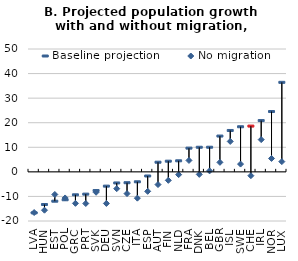
| Category | Baseline projection | No migration |
|---|---|---|
| LVA | -16.692 | -16.557 |
| HUN | -13.288 | -15.61 |
| EST | -11.939 | -9.202 |
| POL | -11.353 | -10.626 |
| GRC | -9.342 | -12.818 |
| PRT | -9.068 | -12.879 |
| SVK | -7.607 | -8.302 |
| DEU | -5.812 | -12.857 |
| SVN | -4.513 | -6.849 |
| CZE | -4.419 | -8.845 |
| ITA | -4.043 | -10.702 |
| ESP | -1.68 | -7.935 |
| AUT | 3.928 | -5.168 |
| FIN | 4.343 | -3.45 |
| NLD | 4.498 | -1.132 |
| FRA | 9.656 | 4.642 |
| DNK | 10.014 | -1.036 |
| BEL | 10.024 | 0.391 |
| GBR | 14.569 | 3.866 |
| ISL | 16.84 | 12.377 |
| SWE | 18.354 | 3.167 |
| CHE | 18.628 | -1.557 |
| IRL | 20.872 | 13.119 |
| NOR | 24.556 | 5.45 |
| LUX | 36.432 | 4.169 |